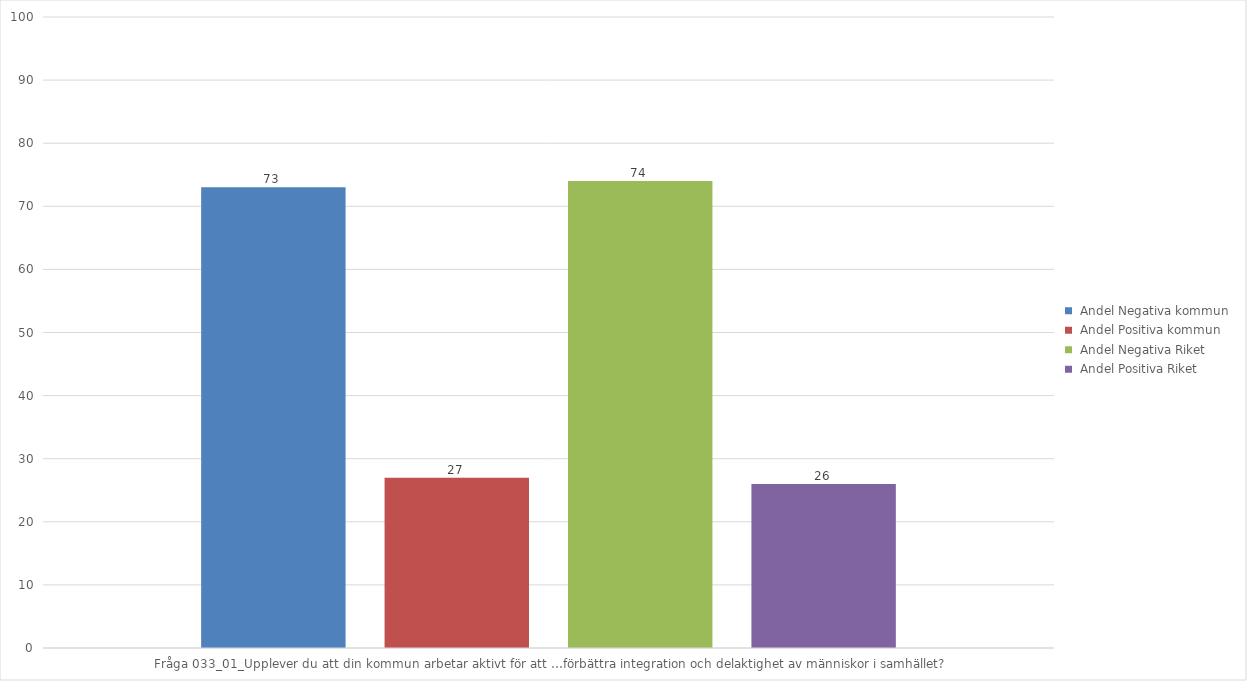
| Category |  Andel Negativa kommun |  Andel Positiva kommun |  Andel Negativa Riket |  Andel Positiva Riket |
|---|---|---|---|---|
| Fråga 033_01_Upplever du att din kommun arbetar aktivt för att …förbättra integration och delaktighet av människor i samhället? | 73 | 27 | 74 | 26 |